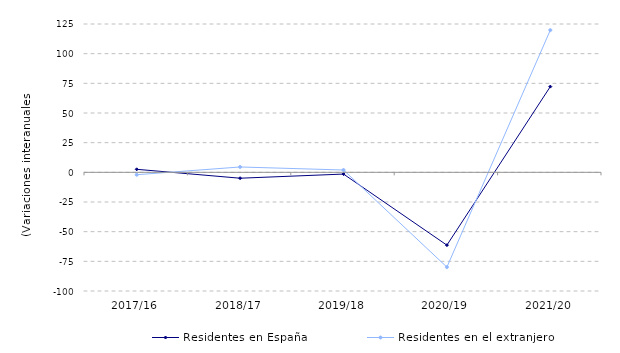
| Category | Residentes en España | Residentes en el extranjero |
|---|---|---|
| 2017/16 | 2.546 | -2.007 |
| 2018/17 | -4.956 | 4.513 |
| 2019/18 | -1.463 | 1.959 |
| 2020/19 | -61.358 | -79.876 |
| 2021/20 | 72.228 | 119.831 |